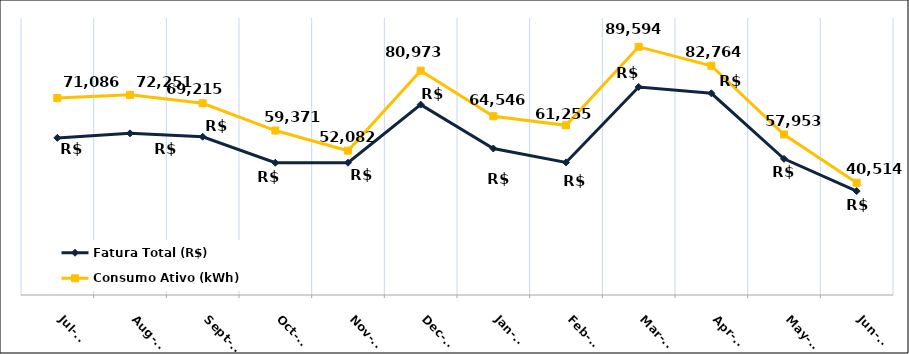
| Category | Fatura Total (R$) | Consumo Ativo (kWh) |
|---|---|---|
| 2023-07-01 | 56719.46 | 71086 |
| 2023-08-01 | 58357.5 | 72251 |
| 2023-09-01 | 57138.05 | 69215 |
| 2023-10-01 | 47756.32 | 59371 |
| 2023-11-01 | 47756.32 | 52082 |
| 2023-12-01 | 68731.86 | 80973 |
| 2024-01-01 | 52887.68 | 64546 |
| 2024-02-01 | 47864.4 | 61255 |
| 2024-03-01 | 75107.1 | 89594 |
| 2024-04-01 | 72815.95 | 82764 |
| 2024-05-01 | 49151.5 | 57953 |
| 2024-06-01 | 37522.2 | 40514 |